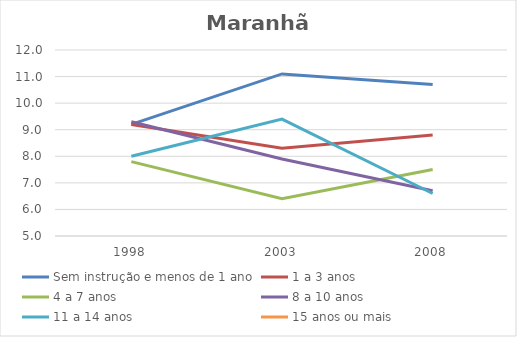
| Category | Sem instrução e menos de 1 ano | 1 a 3 anos | 4 a 7 anos | 8 a 10 anos | 11 a 14 anos | 15 anos ou mais |
|---|---|---|---|---|---|---|
| 1998.0 | 9.2 | 9.2 | 7.8 | 9.3 | 8 | 0 |
| 2003.0 | 11.1 | 8.3 | 6.4 | 7.9 | 9.4 | 0 |
| 2008.0 | 10.7 | 8.8 | 7.5 | 6.7 | 6.6 | 0 |